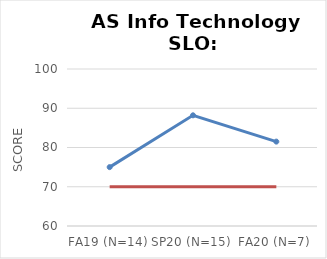
| Category | Series 0 | Series 1 |
|---|---|---|
| FA19 (N=14) | 75 | 70 |
| SP20 (N=15) | 88.2 | 70 |
| FA20 (N=7) | 81.5 | 70 |